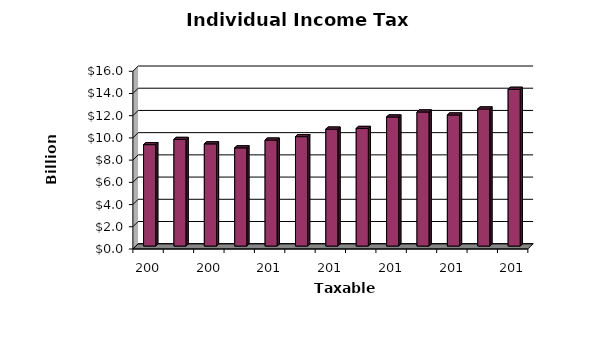
| Category | Series 0 |
|---|---|
| 2006.0 | 9.13 |
| 2007.0 | 9.6 |
| 2008.0 | 9.2 |
| 2009.0 | 8.84 |
| 2010.0 | 9.54 |
| 2011.0 | 9.85 |
| 2012.0 | 10.53 |
| 2013.0 | 10.59 |
| 2014.0 | 11.62 |
| 2015.0 | 12.071 |
| 2016.0 | 11.801 |
| 2017.0 | 12.342 |
| 2018.0 | 14.112 |